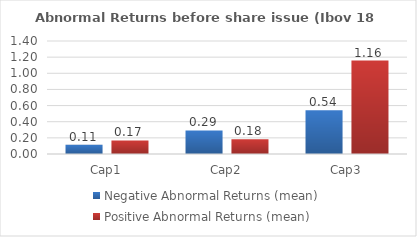
| Category | Negative Abnormal Returns (mean) | Positive Abnormal Returns (mean) |
|---|---|---|
| Cap1 | 0.113 | 0.167 |
| Cap2 | 0.291 | 0.181 |
| Cap3 | 0.543 | 1.158 |